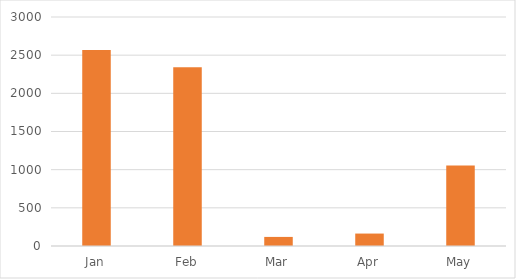
| Category | Series 0 |
|---|---|
| Jan | 2567 |
| Feb | 2343 |
| Mar | 119 |
| Apr | 163 |
| May | 1053 |